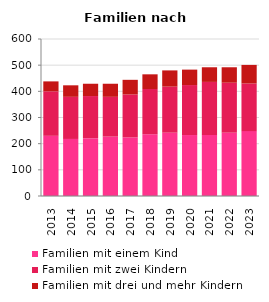
| Category | Familien mit einem Kind | Familien mit zwei Kindern | Familien mit drei und mehr Kindern |
|---|---|---|---|
| 2013.0 | 230 | 170 | 38 |
| 2014.0 | 218 | 161 | 44 |
| 2015.0 | 221 | 161 | 47 |
| 2016.0 | 227 | 152 | 50 |
| 2017.0 | 224 | 164 | 56 |
| 2018.0 | 236 | 173 | 56 |
| 2019.0 | 242 | 176 | 62 |
| 2020.0 | 233 | 191 | 59 |
| 2021.0 | 233 | 203 | 56 |
| 2022.0 | 242 | 191 | 59 |
| 2023.0 | 248 | 182 | 71 |